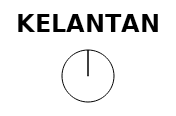
| Category | Series 1 | Series 0 |
|---|---|---|
| Operational Capacity (MW) | 0 | 33.996 |
| In progress (MW) | 30 | 0 |